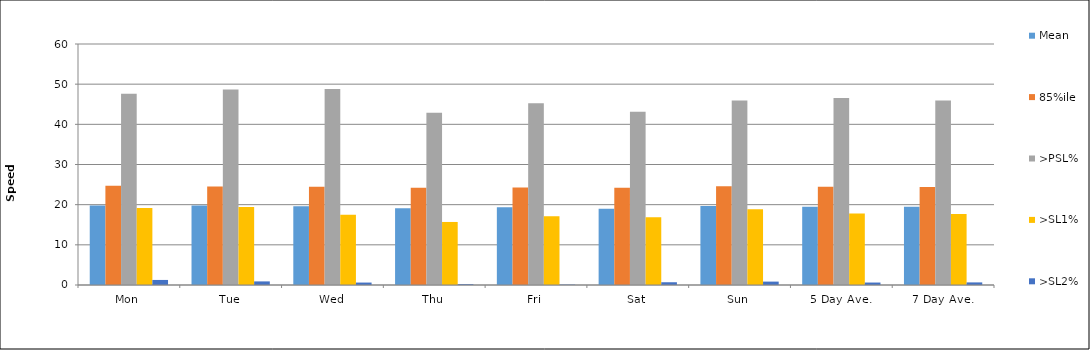
| Category | Mean | 85%ile | >PSL% | >SL1% | >SL2% |
|---|---|---|---|---|---|
| Mon | 19.776 | 24.68 | 47.589 | 19.182 | 1.258 |
| Tue | 19.769 | 24.527 | 48.655 | 19.395 | 0.897 |
| Wed | 19.6 | 24.447 | 48.785 | 17.51 | 0.607 |
| Thu | 19.097 | 24.192 | 42.857 | 15.694 | 0.201 |
| Fri | 19.371 | 24.301 | 45.276 | 17.119 | 0.094 |
| Sat | 19.001 | 24.195 | 43.119 | 16.858 | 0.688 |
| Sun | 19.672 | 24.581 | 45.915 | 18.873 | 0.845 |
| 5 Day Ave. | 19.5 | 24.434 | 46.578 | 17.773 | 0.613 |
| 7 Day Ave. | 19.461 | 24.395 | 45.955 | 17.691 | 0.647 |